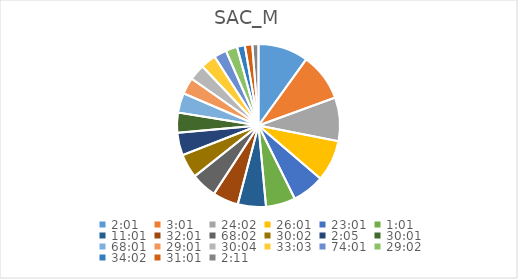
| Category | Series 0 |
|---|---|
| 0.08402777777777777 | 9.953 |
| 0.12569444444444444 | 9.514 |
| 1.0013888888888889 | 8.647 |
| 1.0840277777777778 | 8.218 |
| 0.9590277777777777 | 6.399 |
| 0.042361111111111106 | 5.852 |
| 0.4590277777777778 | 5.581 |
| 1.3340277777777778 | 5.109 |
| 2.834722222222222 | 5.109 |
| 1.2513888888888889 | 4.774 |
| 0.08680555555555557 | 4.508 |
| 1.2506944444444443 | 3.98 |
| 2.8340277777777776 | 3.914 |
| 1.2090277777777778 | 3.262 |
| 1.2527777777777778 | 3.197 |
| 1.3770833333333332 | 3.068 |
| 3.0840277777777776 | 2.491 |
| 1.2097222222222224 | 2.3 |
| 1.4180555555555554 | 1.542 |
| 1.292361111111111 | 1.48 |
| 0.09097222222222222 | 1.23 |